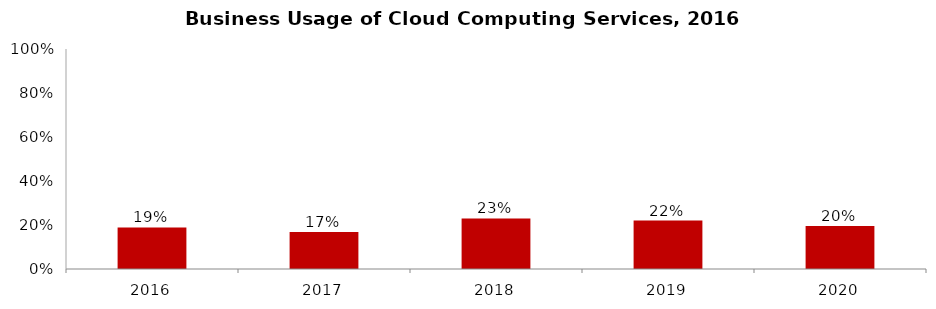
| Category | Business Usage of Cloud Computing Services |
|---|---|
| 2016.0 | 0.189 |
| 2017.0 | 0.168 |
| 2018.0 | 0.23 |
| 2019.0 | 0.22 |
| 2020.0 | 0.196 |